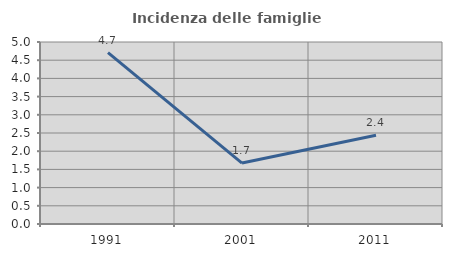
| Category | Incidenza delle famiglie numerose |
|---|---|
| 1991.0 | 4.709 |
| 2001.0 | 1.674 |
| 2011.0 | 2.436 |